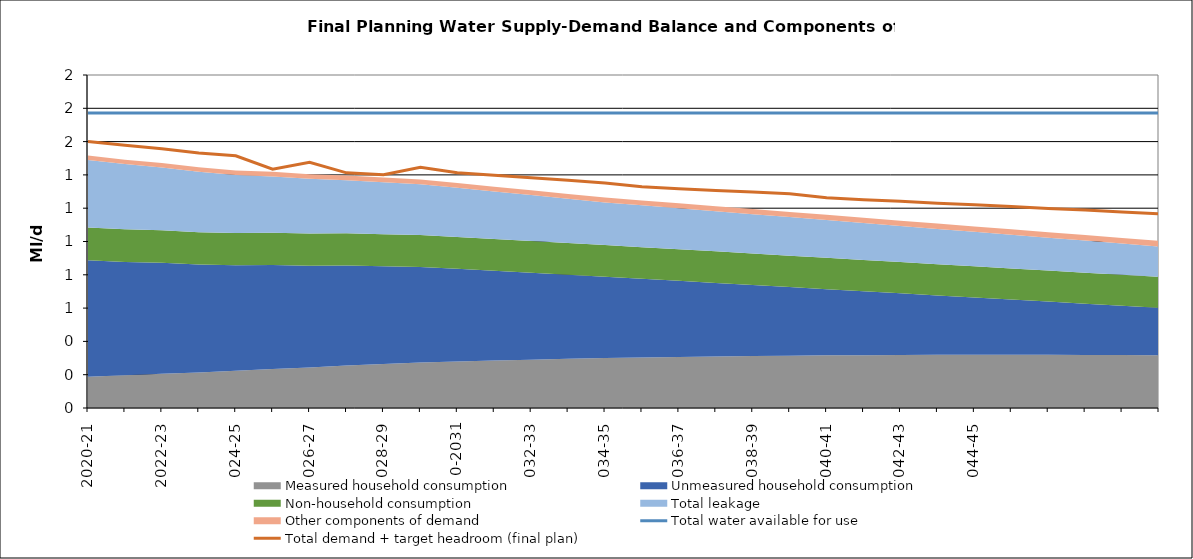
| Category | Total water available for use | Total demand + target headroom (final plan) |
|---|---|---|
| 2020-21 | 1.772 | 1.601 |
| 2021-22 | 1.772 | 1.578 |
| 2022-23 | 1.772 | 1.557 |
| 2023-24 | 1.772 | 1.532 |
| 2024-25 | 1.772 | 1.515 |
| 2025-26 | 1.772 | 1.434 |
| 2026-27 | 1.772 | 1.476 |
| 2027-28 | 1.772 | 1.412 |
| 2028-29 | 1.772 | 1.401 |
| 2029-30 | 1.772 | 1.446 |
| 2030-31 | 1.772 | 1.413 |
| 2031-32 | 1.772 | 1.398 |
| 2032-33 | 1.772 | 1.383 |
| 2033-34 | 1.772 | 1.367 |
| 2034-35 | 1.772 | 1.352 |
| 2035-36 | 1.772 | 1.329 |
| 2036-37 | 1.772 | 1.317 |
| 2037-38 | 1.772 | 1.307 |
| 2038-39 | 1.772 | 1.297 |
| 2039-40 | 1.772 | 1.286 |
| 2040-41 | 1.772 | 1.262 |
| 2041-42 | 1.772 | 1.251 |
| 2042-43 | 1.772 | 1.241 |
| 2043-44 | 1.772 | 1.23 |
| 2044-45 | 1.772 | 1.22 |
| 2045-46 | 1.772 | 1.209 |
| 2046-47 | 1.772 | 1.198 |
| 2047-48 | 1.772 | 1.189 |
| 2048-49 | 1.772 | 1.178 |
| 2049-50 | 1.772 | 1.166 |